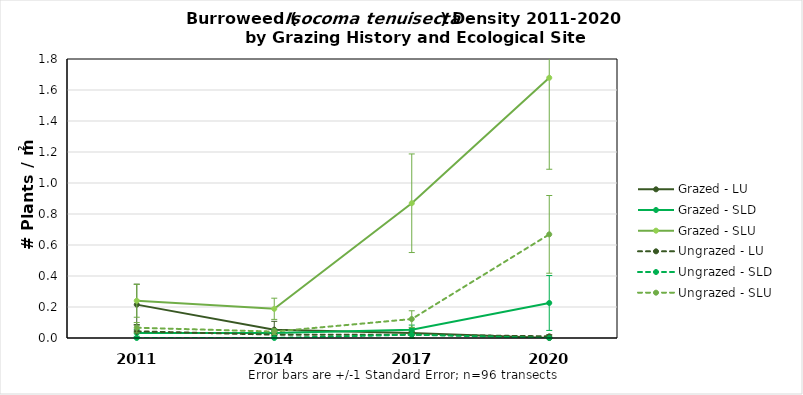
| Category | Grazed - LU | Grazed - SLD | Grazed - SLU | Ungrazed - LU | Ungrazed - SLD | Ungrazed - SLU |
|---|---|---|---|---|---|---|
| 2011.0 | 0.215 | 0.032 | 0.24 | 0.043 | 0 | 0.066 |
| 2014.0 | 0.054 | 0.032 | 0.188 | 0.022 | 0 | 0.041 |
| 2017.0 | 0.032 | 0.054 | 0.869 | 0.022 | 0.022 | 0.122 |
| 2020.0 | 0 | 0.226 | 1.679 | 0.011 | 0 | 0.669 |